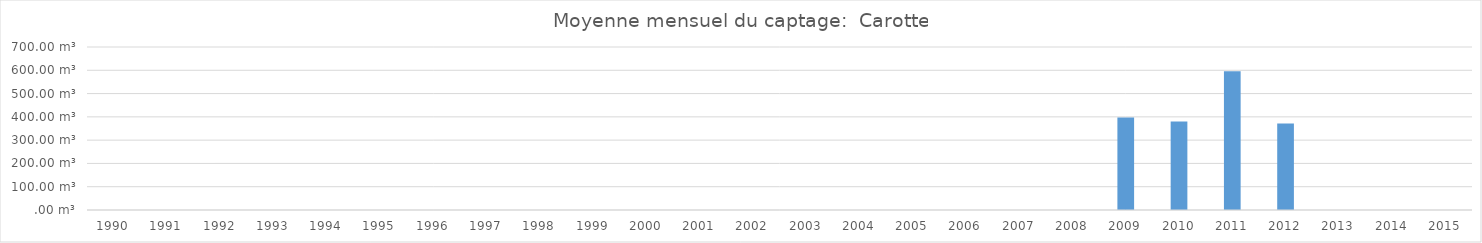
| Category | 1990 1991 1992 1993 1994 1995 1996 1997 1998 1999 2000 2001 2002 2003 2004 2005 2006 2007 2008 2009 2010 2011 2012 2013 2014 2015 |
|---|---|
| 1990.0 | 0 |
| 1991.0 | 0 |
| 1992.0 | 0 |
| 1993.0 | 0 |
| 1994.0 | 0 |
| 1995.0 | 0 |
| 1996.0 | 0 |
| 1997.0 | 0 |
| 1998.0 | 0 |
| 1999.0 | 0 |
| 2000.0 | 0 |
| 2001.0 | 0 |
| 2002.0 | 0 |
| 2003.0 | 0 |
| 2004.0 | 0 |
| 2005.0 | 0 |
| 2006.0 | 0 |
| 2007.0 | 0 |
| 2008.0 | 0 |
| 2009.0 | 397.44 |
| 2010.0 | 380.16 |
| 2011.0 | 596.16 |
| 2012.0 | 371.52 |
| 2013.0 | 0 |
| 2014.0 | 0 |
| 2015.0 | 0 |